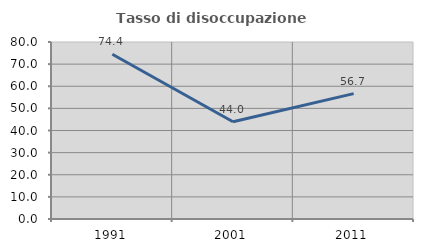
| Category | Tasso di disoccupazione giovanile  |
|---|---|
| 1991.0 | 74.439 |
| 2001.0 | 43.972 |
| 2011.0 | 56.667 |